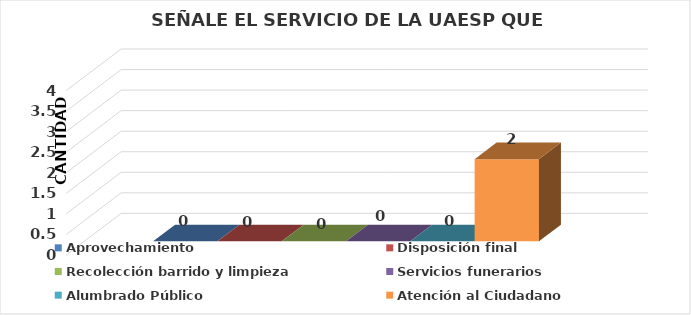
| Category | Aprovechamiento | Disposición final | Recolección barrido y limpieza | Servicios funerarios | Alumbrado Público | Atención al Ciudadano |
|---|---|---|---|---|---|---|
| 0 | 0 | 0 | 0 | 0 | 0 | 2 |